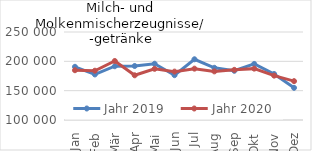
| Category | Jahr 2019 | Jahr 2020 |
|---|---|---|
| Jan | 190663.015 | 184841.554 |
| Feb | 177650.346 | 183992.674 |
| Mär | 191645.709 | 200570.532 |
| Apr | 192052.138 | 176199.541 |
| Mai | 195909.956 | 187240.967 |
| Jun | 176392.45 | 182477.505 |
| Jul | 203511.147 | 187531.458 |
| Aug | 188981.529 | 182881.942 |
| Sep | 183886.212 | 185489.481 |
| Okt | 195564.581 | 187547.342 |
| Nov | 178405.14 | 175620.031 |
| Dez | 154822.392 | 166200.591 |